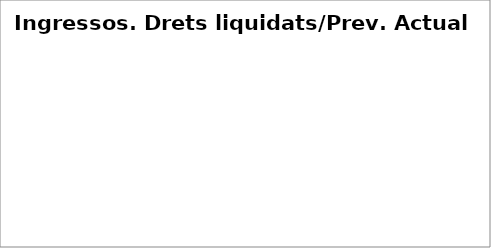
| Category | Series 0 |
|---|---|
| Impostos directes | 0.519 |
| Impostos indirectes | 0.46 |
| Taxes, preus públics i altres ingressos | 0.35 |
| Transferències corrents | 0.408 |
| Ingressos patrimonials | 0.303 |
| Venda d'inversions reals | 0.124 |
| Transferències de capital | 0.097 |
| Actius financers* | 0 |
| Passius financers | 0.007 |